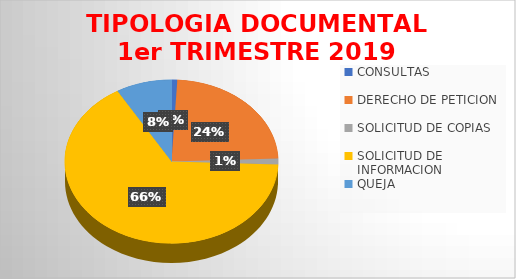
| Category | Series 0 |
|---|---|
| CONSULTAS  | 3 |
| DERECHO DE PETICION | 81 |
| SOLICITUD DE COPIAS  | 4 |
| SOLICITUD DE INFORMACION | 227 |
| QUEJA | 29 |